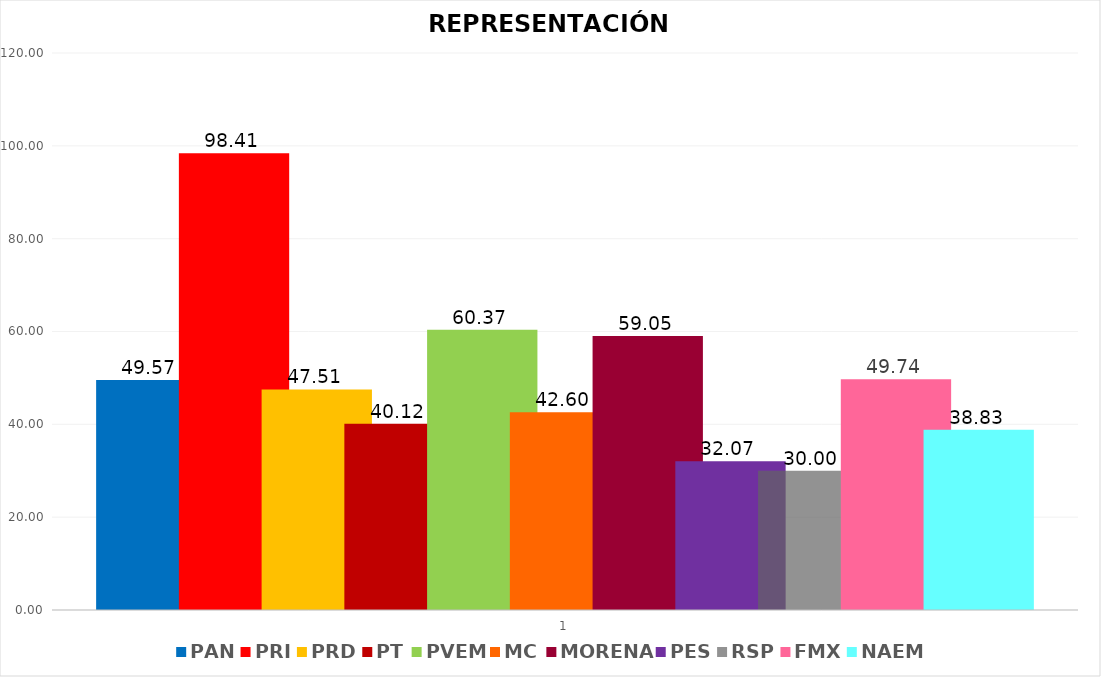
| Category | PAN | PRI | PRD | PT | PVEM | MC | MORENA | PES | RSP | FMX | NAEM |
|---|---|---|---|---|---|---|---|---|---|---|---|
| 0 | 49.571 | 98.414 | 47.514 | 40.124 | 60.371 | 42.595 | 59.048 | 32.067 | 30 | 49.738 | 38.833 |